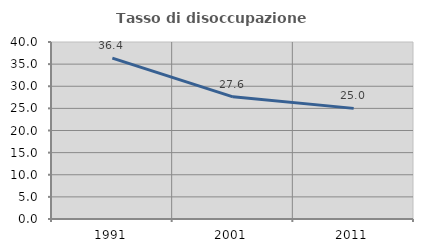
| Category | Tasso di disoccupazione giovanile  |
|---|---|
| 1991.0 | 36.364 |
| 2001.0 | 27.609 |
| 2011.0 | 25 |